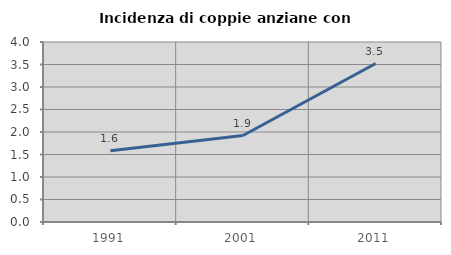
| Category | Incidenza di coppie anziane con figli |
|---|---|
| 1991.0 | 1.586 |
| 2001.0 | 1.921 |
| 2011.0 | 3.522 |